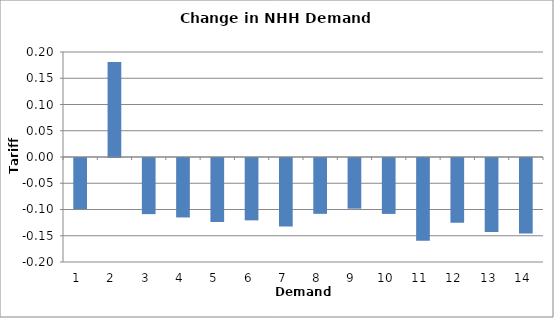
| Category | Change (p/kWh) |
|---|---|
| 1.0 | -0.097 |
| 2.0 | 0.181 |
| 3.0 | -0.107 |
| 4.0 | -0.113 |
| 5.0 | -0.122 |
| 6.0 | -0.119 |
| 7.0 | -0.131 |
| 8.0 | -0.106 |
| 9.0 | -0.096 |
| 10.0 | -0.107 |
| 11.0 | -0.158 |
| 12.0 | -0.123 |
| 13.0 | -0.141 |
| 14.0 | -0.144 |